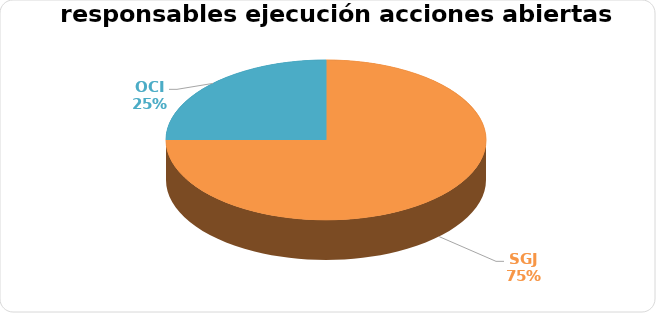
| Category | Series 0 |
|---|---|
| SGJ | 3 |
| OCI | 1 |